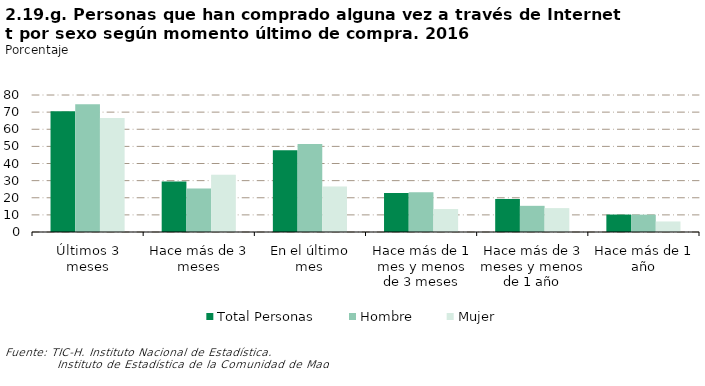
| Category | Total Personas | Hombre | Mujer |
|---|---|---|---|
| Últimos 3 meses | 70.516 | 74.572 | 66.514 |
| Hace más de 3 meses | 29.484 | 25.428 | 33.486 |
| En el último mes | 47.727 | 51.316 | 26.511 |
| Hace más de 1 mes y menos de 3 meses | 22.789 | 23.255 | 13.397 |
| Hace más de 3 meses y menos de 1 año | 19.29 | 15.286 | 13.945 |
| Hace más de 1 año | 10.194 | 10.142 | 6.147 |